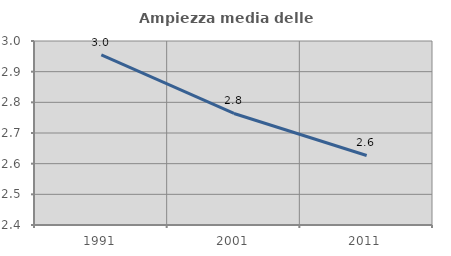
| Category | Ampiezza media delle famiglie |
|---|---|
| 1991.0 | 2.955 |
| 2001.0 | 2.764 |
| 2011.0 | 2.627 |